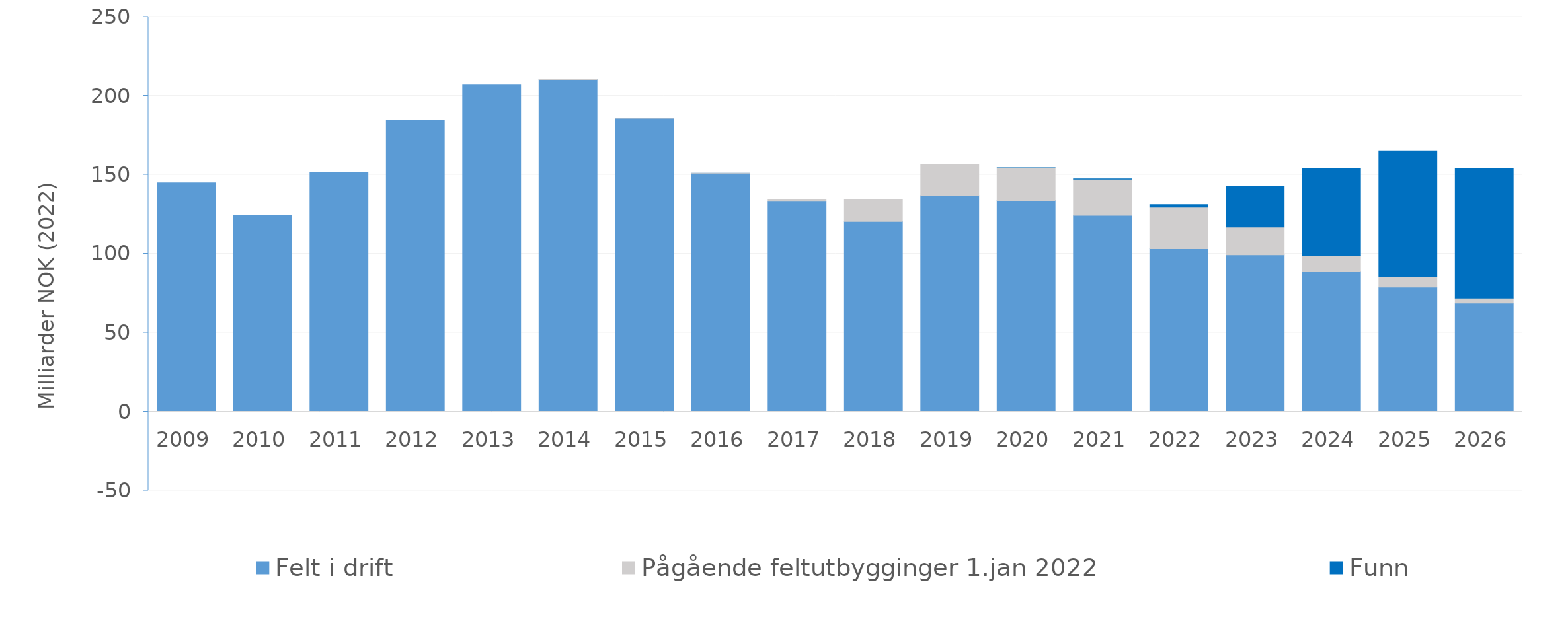
| Category | Felt i drift | Pågående feltutbygginger 1.jan 2022 | Funn |
|---|---|---|---|
| 2009.0 | 144.831 | 0 | 0 |
| 2010.0 | 124.514 | 0 | 0 |
| 2011.0 | 151.625 | 0 | 0 |
| 2012.0 | 184.345 | 0 | 0 |
| 2013.0 | 207.228 | -0.043 | 0 |
| 2014.0 | 210.28 | 0.002 | 0 |
| 2015.0 | 185.752 | 0.004 | 0 |
| 2016.0 | 150.912 | 0.006 | 0 |
| 2017.0 | 133.196 | 1.358 | 0 |
| 2018.0 | 120.372 | 14.109 | 0 |
| 2019.0 | 136.826 | 19.585 | 0 |
| 2020.0 | 133.71 | 20.688 | 0.005 |
| 2021.0 | 124.279 | 22.905 | 0.188 |
| 2022.0 | 103.091 | 26.317 | 1.65 |
| 2023.0 | 99.296 | 17.583 | 25.547 |
| 2024.0 | 88.767 | 10.147 | 55.181 |
| 2025.0 | 78.716 | 6.431 | 80.07 |
| 2026.0 | 68.759 | 3.151 | 82.257 |